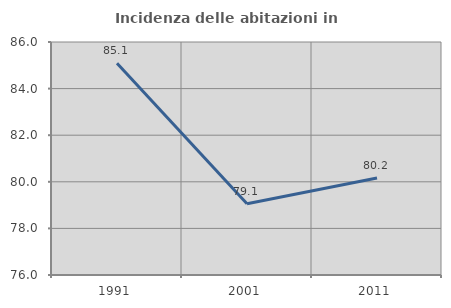
| Category | Incidenza delle abitazioni in proprietà  |
|---|---|
| 1991.0 | 85.091 |
| 2001.0 | 79.055 |
| 2011.0 | 80.165 |